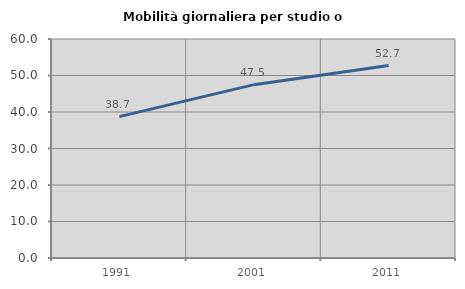
| Category | Mobilità giornaliera per studio o lavoro |
|---|---|
| 1991.0 | 38.729 |
| 2001.0 | 47.492 |
| 2011.0 | 52.712 |